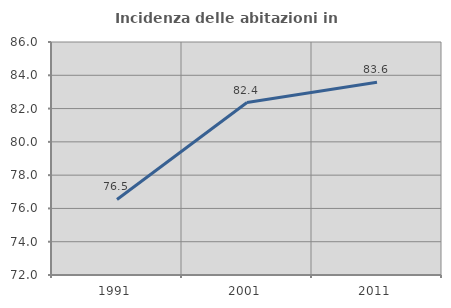
| Category | Incidenza delle abitazioni in proprietà  |
|---|---|
| 1991.0 | 76.538 |
| 2001.0 | 82.362 |
| 2011.0 | 83.587 |